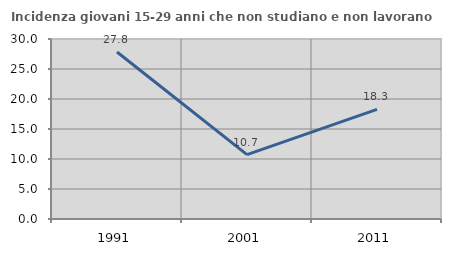
| Category | Incidenza giovani 15-29 anni che non studiano e non lavorano  |
|---|---|
| 1991.0 | 27.826 |
| 2001.0 | 10.738 |
| 2011.0 | 18.257 |